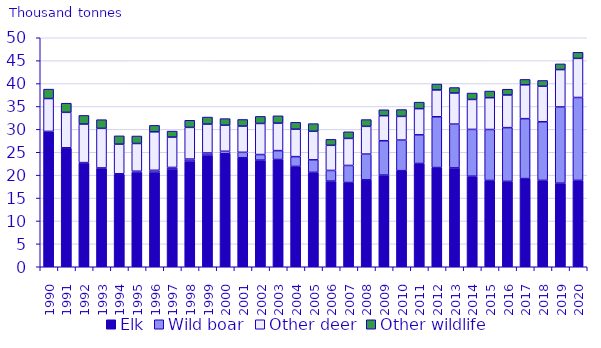
| Category | Elk | Wild boar | Other deer | Other wildlife |
|---|---|---|---|---|
| 1990.0 | 29.516 | 0.038 | 7.172 | 2.058 |
| 1991.0 | 25.913 | 0.066 | 7.734 | 1.995 |
| 1992.0 | 22.67 | 0.073 | 8.416 | 1.885 |
| 1993.0 | 21.398 | 0.178 | 8.637 | 1.903 |
| 1994.0 | 20.117 | 0.187 | 6.471 | 1.808 |
| 1995.0 | 20.688 | 0.173 | 6.051 | 1.637 |
| 1996.0 | 20.644 | 0.419 | 8.402 | 1.405 |
| 1997.0 | 21.34 | 0.347 | 6.62 | 1.314 |
| 1998.0 | 23.061 | 0.451 | 6.923 | 1.547 |
| 1999.0 | 24.364 | 0.477 | 6.306 | 1.536 |
| 2000.0 | 24.676 | 0.539 | 5.693 | 1.438 |
| 2001.0 | 23.79 | 1.198 | 5.726 | 1.445 |
| 2002.0 | 23.278 | 1.222 | 6.787 | 1.542 |
| 2003.0 | 23.415 | 1.941 | 6.001 | 1.602 |
| 2004.0 | 21.905 | 2.139 | 5.993 | 1.502 |
| 2005.0 | 20.615 | 2.732 | 6.232 | 1.674 |
| 2006.0 | 18.701 | 2.328 | 5.489 | 1.3 |
| 2007.0 | 18.385 | 3.733 | 5.903 | 1.451 |
| 2008.0 | 18.981 | 5.617 | 6.064 | 1.474 |
| 2009.0 | 20.007 | 7.509 | 5.467 | 1.296 |
| 2010.0 | 20.985 | 6.672 | 5.173 | 1.495 |
| 2011.0 | 22.547 | 6.262 | 5.709 | 1.424 |
| 2012.0 | 21.658 | 11.091 | 5.858 | 1.282 |
| 2013.0 | 21.582 | 9.562 | 6.793 | 1.197 |
| 2014.0 | 19.77 | 10.219 | 6.536 | 1.401 |
| 2015.0 | 18.84 | 11.129 | 6.942 | 1.458 |
| 2016.0 | 18.641 | 11.733 | 7.134 | 1.255 |
| 2017.0 | 19.246 | 13.091 | 7.39 | 1.178 |
| 2018.0 | 18.854 | 12.808 | 7.746 | 1.268 |
| 2019.0 | 18.24 | 16.652 | 8.157 | 1.246 |
| 2020.0 | 18.854 | 18.104 | 8.537 | 1.331 |